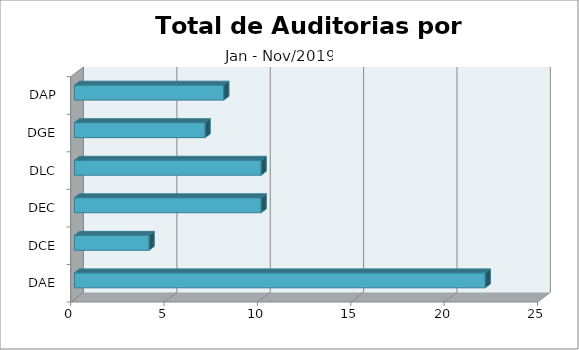
| Category | TOTAL |
|---|---|
| DAE | 22 |
| DCE | 4 |
| DEC | 10 |
| DLC | 10 |
| DGE | 7 |
| DAP | 8 |